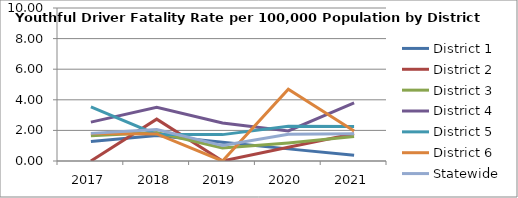
| Category | District 1 | District 2 | District 3 | District 4 | District 5 | District 6 | Statewide |
|---|---|---|---|---|---|---|---|
| 2017.0 | 1.277 | 0 | 1.656 | 2.542 | 3.533 | 1.8 | 1.805 |
| 2018.0 | 1.665 | 2.735 | 1.859 | 3.516 | 1.739 | 1.769 | 2.052 |
| 2019.0 | 1.22 | 0 | 0.847 | 2.487 | 1.724 | 0 | 1.007 |
| 2020.0 | 0.792 | 0.9 | 1.178 | 1.961 | 2.277 | 4.69 | 1.752 |
| 2021.0 | 0.377 | 1.779 | 1.594 | 3.792 | 2.247 | 1.954 | 1.789 |